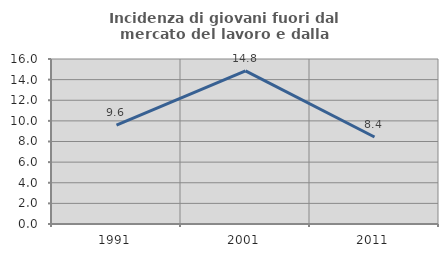
| Category | Incidenza di giovani fuori dal mercato del lavoro e dalla formazione  |
|---|---|
| 1991.0 | 9.596 |
| 2001.0 | 14.844 |
| 2011.0 | 8.439 |